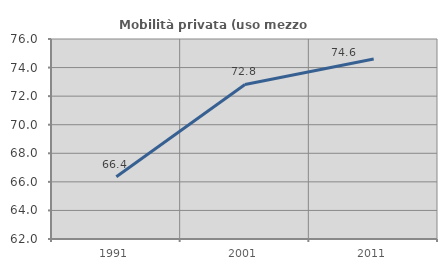
| Category | Mobilità privata (uso mezzo privato) |
|---|---|
| 1991.0 | 66.361 |
| 2001.0 | 72.821 |
| 2011.0 | 74.6 |